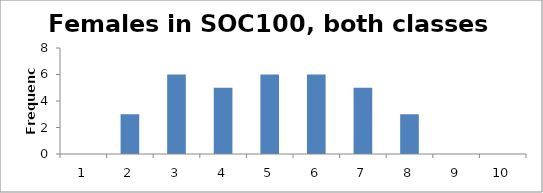
| Category | Frequency |
|---|---|
| 1.0 | 0 |
| 2.0 | 3 |
| 3.0 | 6 |
| 4.0 | 5 |
| 5.0 | 6 |
| 6.0 | 6 |
| 7.0 | 5 |
| 8.0 | 3 |
| 9.0 | 0 |
| 10.0 | 0 |